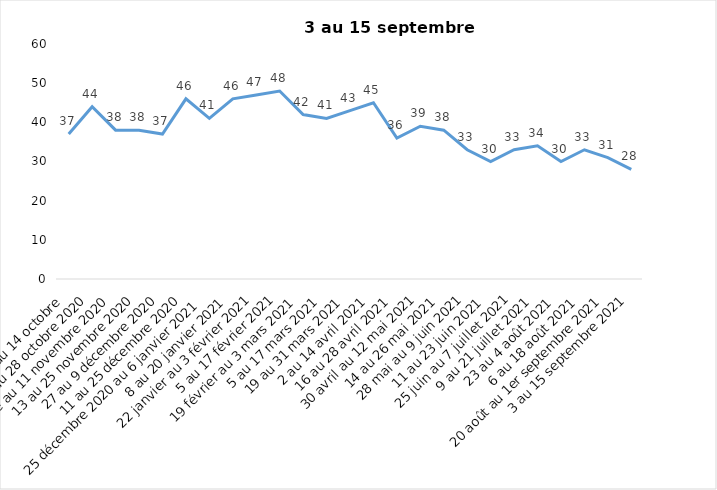
| Category | Toujours aux trois mesures |
|---|---|
| 2 au 14 octobre  | 37 |
| 16 au 28 octobre 2020 | 44 |
| 30 octobre au 11 novembre 2020 | 38 |
| 13 au 25 novembre 2020 | 38 |
| 27 au 9 décembre 2020 | 37 |
| 11 au 25 décembre 2020 | 46 |
| 25 décembre 2020 au 6 janvier 2021 | 41 |
| 8 au 20 janvier 2021 | 46 |
| 22 janvier au 3 février 2021 | 47 |
| 5 au 17 février 2021 | 48 |
| 19 février au 3 mars 2021 | 42 |
| 5 au 17 mars 2021 | 41 |
| 19 au 31 mars 2021 | 43 |
| 2 au 14 avril 2021 | 45 |
| 16 au 28 avril 2021 | 36 |
| 30 avril au 12 mai 2021 | 39 |
| 14 au 26 mai 2021 | 38 |
| 28 mai au 9 juin 2021 | 33 |
| 11 au 23 juin 2021 | 30 |
| 25 juin au 7 juillet 2021 | 33 |
| 9 au 21 juillet 2021 | 34 |
| 23 au 4 août 2021 | 30 |
| 6 au 18 août 2021 | 33 |
| 20 août au 1er septembre 2021 | 31 |
| 3 au 15 septembre 2021 | 28 |